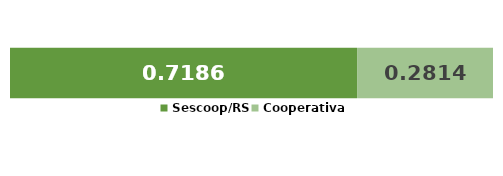
| Category | Sescoop/RS | Cooperativa |
|---|---|---|
| 0 | 0.719 | 0.281 |